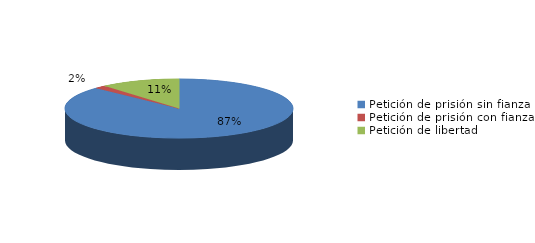
| Category | Series 0 |
|---|---|
| Petición de prisión sin fianza | 162 |
| Petición de prisión con fianza | 3 |
| Petición de libertad | 21 |